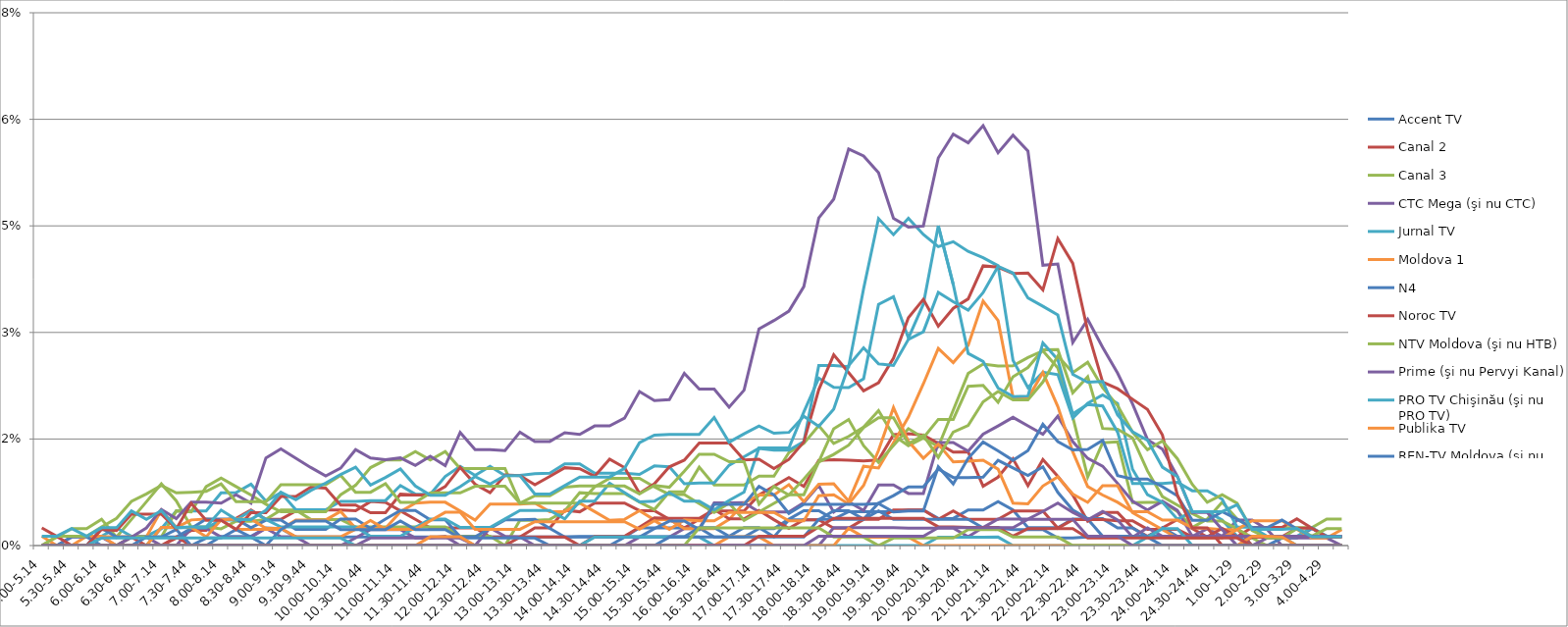
| Category | Accent TV | Canal 2 | Canal 3 | CTC Mega (şi nu CTC) | Jurnal TV | Moldova 1 | N4 | Noroc TV | NTV Moldova (şi nu HTB) | Prime (şi nu Pervyi Kanal) | PRO TV Chişinău (şi nu PRO TV) | Publika TV  | REN-TV Moldova (şi nu REN TV)  | RTR Moldova( şi nu PTP)  | THT Exclusiv (şi nu THT) | TV8 | TVC 21 | TVR MOLDOVA (şi nu TVR) | Canal Regional | Familia Domashniy | ITV | Moldova 2 | Alt canal |
|---|---|---|---|---|---|---|---|---|---|---|---|---|---|---|---|---|---|---|---|---|---|---|---|
| 5.00-5.14 | 0 | 0 | 0 | 0 | 0 | 0 | 0 | 0 | 0 | 0 | 0 | 0.001 | 0 | 0.002 | 0 | 0 | 0 | 0 | 0 | 0 | 0 | 0 | 0.001 |
| 5.15-5.29 | 0 | 0 | 0.001 | 0 | 0 | 0 | 0 | 0 | 0 | 0 | 0 | 0 | 0 | 0.001 | 0.001 | 0 | 0 | 0 | 0 | 0 | 0 | 0 | 0.001 |
| 5.30-5.44 | 0 | 0 | 0.002 | 0 | 0 | 0 | 0 | 0 | 0 | 0.001 | 0 | 0 | 0.001 | 0 | 0.001 | 0 | 0 | 0 | 0 | 0 | 0 | 0 | 0.002 |
| 5.45-5.59 | 0 | 0 | 0.002 | 0 | 0 | 0 | 0 | 0 | 0 | 0.001 | 0 | 0.001 | 0.001 | 0 | 0.001 | 0 | 0 | 0 | 0 | 0 | 0 | 0 | 0.001 |
| 6.00-6.14 | 0 | 0 | 0.004 | 0 | 0.001 | 0.001 | 0.002 | 0 | 0 | 0.001 | 0 | 0.001 | 0 | 0.002 | 0.003 | 0 | 0.001 | 0 | 0 | 0 | 0 | 0 | 0.003 |
| 6.15-6.29 | 0 | 0 | 0.001 | 0 | 0.003 | 0.001 | 0.001 | 0 | 0 | 0 | 0 | 0 | 0 | 0.002 | 0.004 | 0 | 0.001 | 0 | 0 | 0 | 0 | 0 | 0.003 |
| 6.30-6.44 | 0 | 0.001 | 0.004 | 0.001 | 0.001 | 0.001 | 0.001 | 0 | 0.001 | 0.001 | 0 | 0 | 0 | 0.004 | 0.006 | 0 | 0.001 | 0 | 0 | 0 | 0 | 0 | 0.005 |
| 6.45-6.59 | 0 | 0 | 0.006 | 0.001 | 0.001 | 0.001 | 0.001 | 0 | 0.001 | 0.002 | 0 | 0 | 0.001 | 0.004 | 0.007 | 0 | 0.001 | 0 | 0 | 0 | 0 | 0 | 0.004 |
| 7.00-7.14 | 0 | 0 | 0.009 | 0 | 0.002 | 0.005 | 0.001 | 0 | 0.001 | 0.005 | 0.003 | 0.003 | 0.001 | 0.004 | 0.008 | 0 | 0.001 | 0 | 0 | 0 | 0 | 0 | 0.005 |
| 7.15-7.29 | 0 | 0.001 | 0.006 | 0 | 0.005 | 0.003 | 0.001 | 0.001 | 0.005 | 0.004 | 0.003 | 0.003 | 0.002 | 0.002 | 0.007 | 0 | 0.001 | 0 | 0 | 0 | 0 | 0 | 0.003 |
| 7.30-7.44 | 0 | 0.002 | 0.003 | 0.002 | 0.005 | 0.004 | 0.002 | 0 | 0.005 | 0.006 | 0.003 | 0.003 | 0 | 0.006 | 0.008 | 0 | 0.001 | 0 | 0 | 0 | 0 | 0 | 0.003 |
| 7.45-7.59 | 0 | 0.002 | 0.003 | 0.002 | 0.005 | 0.004 | 0.004 | 0 | 0.008 | 0.006 | 0.003 | 0.001 | 0.001 | 0.004 | 0.008 | 0 | 0.001 | 0 | 0 | 0 | 0 | 0 | 0.003 |
| 8.00-8.14 | 0.001 | 0.004 | 0.002 | 0.001 | 0.007 | 0.004 | 0.004 | 0 | 0.009 | 0.006 | 0.004 | 0.004 | 0.001 | 0.004 | 0.009 | 0 | 0.001 | 0 | 0 | 0 | 0 | 0 | 0.005 |
| 8.15-8.29 | 0.001 | 0.004 | 0.003 | 0.001 | 0.007 | 0.002 | 0.004 | 0 | 0.008 | 0.007 | 0.004 | 0.004 | 0.002 | 0.002 | 0.006 | 0 | 0.001 | 0 | 0 | 0 | 0 | 0 | 0.004 |
| 8.30-8.44 | 0.001 | 0.005 | 0.003 | 0.001 | 0.009 | 0.002 | 0.003 | 0 | 0.007 | 0.006 | 0.005 | 0.004 | 0.001 | 0.005 | 0.006 | 0 | 0.001 | 0 | 0 | 0 | 0 | 0 | 0.004 |
| 8.45-8.59 | 0.002 | 0.004 | 0.004 | 0.002 | 0.006 | 0.002 | 0.004 | 0 | 0.006 | 0.012 | 0.004 | 0.002 | 0 | 0.005 | 0.006 | 0 | 0.001 | 0 | 0 | 0 | 0 | 0 | 0.005 |
| 9.00-9.14 | 0.002 | 0.004 | 0.005 | 0.001 | 0.007 | 0.002 | 0.004 | 0 | 0.005 | 0.014 | 0.003 | 0.002 | 0.002 | 0.007 | 0.009 | 0 | 0.001 | 0 | 0 | 0 | 0 | 0 | 0.008 |
| 9.15-9.29 | 0.001 | 0.005 | 0.005 | 0.001 | 0.005 | 0.004 | 0.002 | 0 | 0.005 | 0.012 | 0.003 | 0.001 | 0.003 | 0.007 | 0.009 | 0 | 0.001 | 0 | 0 | 0 | 0 | 0 | 0.006 |
| 9.30-9.44 | 0.001 | 0.005 | 0.004 | 0 | 0.005 | 0.004 | 0.002 | 0 | 0.005 | 0.011 | 0.003 | 0.001 | 0.003 | 0.008 | 0.009 | 0 | 0.001 | 0 | 0 | 0 | 0 | 0 | 0.008 |
| 9.45-9.59 | 0.001 | 0.005 | 0.004 | 0 | 0.005 | 0.004 | 0.002 | 0 | 0.005 | 0.01 | 0.003 | 0.001 | 0.003 | 0.008 | 0.009 | 0 | 0.001 | 0 | 0 | 0 | 0 | 0 | 0.009 |
| 10.00-10.14 | 0.001 | 0.005 | 0.004 | 0 | 0.006 | 0.005 | 0.004 | 0 | 0.007 | 0.011 | 0.003 | 0.001 | 0.002 | 0.006 | 0.01 | 0 | 0.001 | 0 | 0 | 0 | 0 | 0 | 0.01 |
| 10.15-10.29 | 0.001 | 0.005 | 0.003 | 0.001 | 0.006 | 0.002 | 0.004 | 0 | 0.008 | 0.014 | 0.003 | 0.002 | 0.002 | 0.006 | 0.008 | 0 | 0 | 0 | 0 | 0 | 0 | 0 | 0.011 |
| 10.30-10.44 | 0.001 | 0.006 | 0.003 | 0.002 | 0.006 | 0.002 | 0.002 | 0 | 0.011 | 0.012 | 0.001 | 0.004 | 0.002 | 0.005 | 0.008 | 0.001 | 0 | 0 | 0 | 0 | 0 | 0 | 0.009 |
| 10.45-10.59 | 0.001 | 0.006 | 0.003 | 0.002 | 0.006 | 0.002 | 0.004 | 0 | 0.012 | 0.012 | 0.001 | 0.002 | 0.002 | 0.005 | 0.009 | 0.001 | 0 | 0 | 0 | 0 | 0 | 0 | 0.01 |
| 11.00-11.14 | 0.001 | 0.005 | 0.003 | 0.002 | 0.008 | 0.005 | 0.005 | 0 | 0.012 | 0.012 | 0.001 | 0.002 | 0.003 | 0.007 | 0.006 | 0.001 | 0 | 0 | 0 | 0 | 0 | 0 | 0.011 |
| 11.15-11.29 | 0.001 | 0.004 | 0.003 | 0.001 | 0.007 | 0.006 | 0.005 | 0 | 0.013 | 0.011 | 0.003 | 0.002 | 0.002 | 0.007 | 0.006 | 0.001 | 0 | 0 | 0 | 0 | 0 | 0 | 0.008 |
| 11.30-11.44 | 0.001 | 0.002 | 0.003 | 0.001 | 0.007 | 0.006 | 0.004 | 0 | 0.012 | 0.013 | 0.004 | 0.003 | 0.002 | 0.007 | 0.007 | 0.001 | 0 | 0.001 | 0 | 0 | 0 | 0 | 0.007 |
| 11.45-11.59 | 0.001 | 0.002 | 0.003 | 0.001 | 0.01 | 0.006 | 0.004 | 0 | 0.013 | 0.011 | 0.004 | 0.005 | 0.002 | 0.008 | 0.007 | 0.001 | 0 | 0.001 | 0 | 0 | 0 | 0 | 0.007 |
| 12.00-12.14 | 0.001 | 0.002 | 0.001 | 0 | 0.011 | 0.005 | 0.001 | 0 | 0.011 | 0.016 | 0.003 | 0.005 | 0.001 | 0.011 | 0.007 | 0.001 | 0 | 0.001 | 0 | 0 | 0 | 0 | 0.008 |
| 12.15-12.29 | 0.001 | 0.002 | 0.001 | 0 | 0.01 | 0.004 | 0.001 | 0 | 0.011 | 0.014 | 0.003 | 0.002 | 0.001 | 0.009 | 0.008 | 0 | 0 | 0 | 0 | 0 | 0 | 0 | 0.01 |
| 12.30-12.44 | 0.001 | 0.001 | 0.001 | 0.002 | 0.011 | 0.006 | 0.002 | 0 | 0.011 | 0.014 | 0.003 | 0.002 | 0.001 | 0.007 | 0.008 | 0 | 0 | 0 | 0 | 0 | 0 | 0 | 0.009 |
| 12.45-12.59 | 0.001 | 0.001 | 0 | 0.001 | 0.01 | 0.006 | 0.004 | 0 | 0.011 | 0.013 | 0.004 | 0.002 | 0.001 | 0.01 | 0.008 | 0 | 0 | 0 | 0 | 0 | 0 | 0 | 0.01 |
| 13.00-13.14 | 0.001 | 0.001 | 0.004 | 0.001 | 0.01 | 0.006 | 0.004 | 0.001 | 0.006 | 0.016 | 0.005 | 0.002 | 0.001 | 0.01 | 0.006 | 0 | 0 | 0 | 0 | 0 | 0 | 0 | 0.01 |
| 13.15-13.29 | 0.001 | 0.002 | 0.004 | 0 | 0.01 | 0.006 | 0.004 | 0.001 | 0.006 | 0.015 | 0.005 | 0.003 | 0.001 | 0.009 | 0.007 | 0 | 0 | 0 | 0 | 0 | 0 | 0 | 0.007 |
| 13.30-13.44 | 0.001 | 0.002 | 0.004 | 0 | 0.01 | 0.005 | 0.002 | 0.001 | 0.006 | 0.015 | 0.005 | 0.003 | 0 | 0.01 | 0.007 | 0 | 0 | 0 | 0 | 0 | 0 | 0 | 0.007 |
| 13.45-13.59 | 0.001 | 0.005 | 0.005 | 0 | 0.011 | 0.005 | 0.001 | 0.001 | 0.006 | 0.016 | 0.004 | 0.003 | 0 | 0.011 | 0.008 | 0 | 0 | 0 | 0 | 0 | 0 | 0 | 0.008 |
| 14.00-14.14 | 0.001 | 0.005 | 0.007 | 0 | 0.011 | 0.006 | 0.001 | 0 | 0.006 | 0.016 | 0.006 | 0.003 | 0 | 0.011 | 0.008 | 0 | 0 | 0 | 0 | 0 | 0 | 0 | 0.01 |
| 14.15-14.29 | 0.001 | 0.006 | 0.007 | 0 | 0.01 | 0.005 | 0.001 | 0.001 | 0.008 | 0.017 | 0.006 | 0.003 | 0 | 0.01 | 0.008 | 0 | 0.001 | 0 | 0 | 0 | 0 | 0 | 0.01 |
| 14.30-14.44 | 0.001 | 0.006 | 0.007 | 0 | 0.01 | 0.004 | 0.001 | 0.001 | 0.009 | 0.017 | 0.009 | 0.003 | 0 | 0.012 | 0.008 | 0 | 0.001 | 0 | 0 | 0 | 0 | 0 | 0.01 |
| 14.45-14.59 | 0.001 | 0.006 | 0.007 | 0 | 0.01 | 0.004 | 0.001 | 0.001 | 0.009 | 0.018 | 0.007 | 0.003 | 0.001 | 0.011 | 0.008 | 0 | 0.001 | 0 | 0 | 0 | 0 | 0 | 0.011 |
| 15.00-15.14 | 0.002 | 0.005 | 0.006 | 0.001 | 0.01 | 0.005 | 0.001 | 0.003 | 0.009 | 0.022 | 0.006 | 0.002 | 0.001 | 0.007 | 0.007 | 0 | 0.001 | 0 | 0 | 0 | 0 | 0 | 0.014 |
| 15.15-15.29 | 0.002 | 0.005 | 0.005 | 0.001 | 0.011 | 0.004 | 0.001 | 0.004 | 0.008 | 0.02 | 0.006 | 0.003 | 0.002 | 0.009 | 0.008 | 0 | 0.001 | 0 | 0 | 0 | 0 | 0 | 0.016 |
| 15.30-15.44 | 0.002 | 0.004 | 0.008 | 0.001 | 0.011 | 0.004 | 0.001 | 0.004 | 0.007 | 0.021 | 0.007 | 0.002 | 0.003 | 0.011 | 0.008 | 0 | 0.001 | 0 | 0.001 | 0 | 0 | 0 | 0.016 |
| 15.45-15.59 | 0.002 | 0.002 | 0.008 | 0.002 | 0.009 | 0.002 | 0.001 | 0.004 | 0.007 | 0.024 | 0.006 | 0.004 | 0.003 | 0.012 | 0.01 | 0 | 0.001 | 0 | 0.001 | 0 | 0 | 0 | 0.016 |
| 16.00-16.14 | 0.002 | 0.004 | 0.011 | 0.002 | 0.009 | 0.002 | 0.003 | 0.004 | 0.006 | 0.022 | 0.006 | 0.003 | 0.002 | 0.014 | 0.013 | 0 | 0.001 | 0 | 0.001 | 0 | 0.002 | 0 | 0.016 |
| 16.15-16.29 | 0.001 | 0.005 | 0.009 | 0.006 | 0.009 | 0.002 | 0.003 | 0.005 | 0.005 | 0.022 | 0.005 | 0.003 | 0.006 | 0.014 | 0.013 | 0 | 0 | 0 | 0.001 | 0 | 0.002 | 0 | 0.018 |
| 16.30-16.44 | 0.001 | 0.005 | 0.009 | 0.006 | 0.011 | 0.004 | 0.001 | 0.004 | 0.006 | 0.019 | 0.006 | 0.005 | 0.006 | 0.014 | 0.012 | 0 | 0 | 0.001 | 0.001 | 0 | 0.002 | 0 | 0.015 |
| 16.45-16.59 | 0.001 | 0.005 | 0.009 | 0.006 | 0.013 | 0.006 | 0.003 | 0.004 | 0.004 | 0.022 | 0.008 | 0.005 | 0.006 | 0.012 | 0.012 | 0 | 0 | 0.001 | 0.001 | 0 | 0.002 | 0 | 0.016 |
| 17.00-17.14 | 0.002 | 0.007 | 0.01 | 0.005 | 0.014 | 0.007 | 0.003 | 0.005 | 0.005 | 0.03 | 0.014 | 0.005 | 0.008 | 0.012 | 0.006 | 0 | 0 | 0.001 | 0.001 | 0.001 | 0.002 | 0 | 0.017 |
| 17.15-17.29 | 0.002 | 0.008 | 0.01 | 0.005 | 0.013 | 0.007 | 0.001 | 0.004 | 0.006 | 0.032 | 0.014 | 0.005 | 0.007 | 0.011 | 0.008 | 0 | 0 | 0 | 0.001 | 0.001 | 0.002 | 0 | 0.016 |
| 17.30-17.44 | 0.004 | 0.01 | 0.013 | 0.005 | 0.013 | 0.009 | 0.004 | 0.002 | 0.007 | 0.033 | 0.014 | 0.003 | 0.005 | 0.012 | 0.007 | 0 | 0 | 0 | 0.001 | 0.001 | 0.002 | 0 | 0.016 |
| 17.45-17.59 | 0.005 | 0.008 | 0.014 | 0.006 | 0.015 | 0.006 | 0.004 | 0.004 | 0.007 | 0.036 | 0.019 | 0.003 | 0.006 | 0.015 | 0.009 | 0 | 0 | 0 | 0.001 | 0.001 | 0.002 | 0 | 0.018 |
| 18.00-18.14 | 0.005 | 0.012 | 0.017 | 0.008 | 0.025 | 0.009 | 0.004 | 0.004 | 0.012 | 0.046 | 0.024 | 0.007 | 0.006 | 0.022 | 0.012 | 0 | 0 | 0 | 0.004 | 0.003 | 0.002 | 0.001 | 0.017 |
| 18.15-18.29 | 0.004 | 0.012 | 0.014 | 0.005 | 0.025 | 0.009 | 0.005 | 0.002 | 0.016 | 0.049 | 0.022 | 0.007 | 0.006 | 0.027 | 0.013 | 0.003 | 0 | 0 | 0.004 | 0.004 | 0.001 | 0.001 | 0.019 |
| 18.30-18.44 | 0.005 | 0.012 | 0.015 | 0.006 | 0.025 | 0.006 | 0.005 | 0.002 | 0.018 | 0.056 | 0.022 | 0.006 | 0.006 | 0.024 | 0.014 | 0.003 | 0 | 0.002 | 0.004 | 0.004 | 0.001 | 0.001 | 0.025 |
| 18.45-18.59 | 0.005 | 0.012 | 0.017 | 0.005 | 0.036 | 0.011 | 0.004 | 0.004 | 0.014 | 0.055 | 0.023 | 0.008 | 0.006 | 0.022 | 0.017 | 0.003 | 0 | 0.001 | 0.004 | 0.004 | 0.001 | 0.001 | 0.028 |
| 19.00-19.14 | 0.005 | 0.012 | 0.019 | 0.009 | 0.046 | 0.011 | 0.006 | 0.004 | 0.012 | 0.052 | 0.034 | 0.013 | 0.006 | 0.023 | 0.018 | 0.003 | 0 | 0.001 | 0.005 | 0.004 | 0 | 0.001 | 0.026 |
| 19.15-19.29 | 0.005 | 0.016 | 0.016 | 0.009 | 0.044 | 0.014 | 0.007 | 0.005 | 0.014 | 0.046 | 0.035 | 0.019 | 0.005 | 0.026 | 0.018 | 0.003 | 0 | 0.001 | 0.004 | 0.004 | 0.001 | 0.001 | 0.025 |
| 19.30-19.44 | 0.005 | 0.016 | 0.014 | 0.007 | 0.046 | 0.018 | 0.008 | 0.005 | 0.016 | 0.045 | 0.029 | 0.015 | 0.005 | 0.032 | 0.014 | 0.002 | 0 | 0.001 | 0.004 | 0.004 | 0.001 | 0.001 | 0.029 |
| 19.45-19.59 | 0.005 | 0.016 | 0.015 | 0.007 | 0.044 | 0.023 | 0.008 | 0.005 | 0.015 | 0.045 | 0.034 | 0.012 | 0.005 | 0.035 | 0.016 | 0.002 | 0 | 0 | 0.004 | 0.004 | 0.001 | 0.001 | 0.03 |
| 20.00-20.14 | 0.004 | 0.014 | 0.014 | 0.015 | 0.042 | 0.028 | 0.011 | 0.004 | 0.018 | 0.055 | 0.045 | 0.014 | 0.011 | 0.031 | 0.012 | 0.002 | 0.001 | 0 | 0.004 | 0.003 | 0.001 | 0.003 | 0.036 |
| 20.15-20.29 | 0.004 | 0.013 | 0.019 | 0.015 | 0.043 | 0.026 | 0.01 | 0.005 | 0.018 | 0.058 | 0.037 | 0.012 | 0.009 | 0.033 | 0.016 | 0.002 | 0.001 | 0 | 0.004 | 0.003 | 0.001 | 0.003 | 0.034 |
| 20.30-20.44 | 0.005 | 0.013 | 0.024 | 0.013 | 0.041 | 0.028 | 0.01 | 0.004 | 0.022 | 0.057 | 0.027 | 0.012 | 0.012 | 0.035 | 0.017 | 0.001 | 0.001 | 0 | 0.004 | 0.003 | 0.002 | 0.003 | 0.033 |
| 20.45-20.59 | 0.005 | 0.008 | 0.026 | 0.016 | 0.041 | 0.034 | 0.01 | 0.004 | 0.023 | 0.059 | 0.026 | 0.012 | 0.015 | 0.039 | 0.02 | 0.003 | 0.001 | 0 | 0.002 | 0.003 | 0.002 | 0.003 | 0.036 |
| 21.00-21.14 | 0.006 | 0.01 | 0.025 | 0.017 | 0.039 | 0.032 | 0.012 | 0.004 | 0.02 | 0.055 | 0.022 | 0.011 | 0.013 | 0.039 | 0.022 | 0.004 | 0.001 | 0 | 0.002 | 0.003 | 0.002 | 0.003 | 0.039 |
| 21.15-21.29 | 0.005 | 0.012 | 0.025 | 0.018 | 0.026 | 0.021 | 0.011 | 0.005 | 0.024 | 0.058 | 0.021 | 0.006 | 0.012 | 0.038 | 0.02 | 0.004 | 0 | 0 | 0.002 | 0.001 | 0.001 | 0.003 | 0.038 |
| 21.30-21.44 | 0.003 | 0.008 | 0.026 | 0.017 | 0.022 | 0.021 | 0.01 | 0.005 | 0.025 | 0.056 | 0.021 | 0.006 | 0.013 | 0.038 | 0.021 | 0.004 | 0 | 0 | 0.002 | 0.002 | 0.001 | 0.004 | 0.035 |
| 21.45-21.59 | 0.003 | 0.012 | 0.027 | 0.016 | 0.024 | 0.024 | 0.011 | 0.005 | 0.028 | 0.039 | 0.029 | 0.008 | 0.017 | 0.036 | 0.023 | 0.005 | 0 | 0 | 0.002 | 0.002 | 0.001 | 0.004 | 0.034 |
| 22.00-22.14 | 0.003 | 0.01 | 0.025 | 0.018 | 0.024 | 0.02 | 0.007 | 0.002 | 0.028 | 0.04 | 0.026 | 0.01 | 0.015 | 0.043 | 0.027 | 0.006 | 0 | 0 | 0.001 | 0.002 | 0.001 | 0.004 | 0.032 |
| 22.15-22.29 | 0.004 | 0.007 | 0.018 | 0.015 | 0.018 | 0.013 | 0.005 | 0.004 | 0.022 | 0.029 | 0.019 | 0.007 | 0.013 | 0.04 | 0.024 | 0.005 | 0 | 0 | 0.001 | 0.002 | 0 | 0.004 | 0.024 |
| 22.30-22.44 | 0.004 | 0.003 | 0.01 | 0.012 | 0.02 | 0.008 | 0.004 | 0.004 | 0.024 | 0.032 | 0.02 | 0.006 | 0.014 | 0.03 | 0.026 | 0.004 | 0 | 0 | 0.001 | 0.001 | 0 | 0.001 | 0.023 |
| 22.45-22.59 | 0.001 | 0.005 | 0.014 | 0.011 | 0.021 | 0.007 | 0.004 | 0.004 | 0.016 | 0.028 | 0.02 | 0.008 | 0.015 | 0.023 | 0.022 | 0.005 | 0 | 0 | 0.001 | 0.001 | 0 | 0.001 | 0.023 |
| 23.00-23.14 | 0.001 | 0.005 | 0.015 | 0.009 | 0.02 | 0.006 | 0.002 | 0.003 | 0.016 | 0.024 | 0.016 | 0.008 | 0.01 | 0.022 | 0.02 | 0.004 | 0 | 0 | 0.001 | 0.001 | 0 | 0.001 | 0.018 |
| 23.15-23.29 | 0.001 | 0.002 | 0.006 | 0.006 | 0.011 | 0.005 | 0.002 | 0.003 | 0.015 | 0.02 | 0.009 | 0.005 | 0.009 | 0.021 | 0.016 | 0.001 | 0 | 0 | 0.001 | 0.001 | 0 | 0 | 0.016 |
| 23.30-23.44 | 0.001 | 0.001 | 0.006 | 0.005 | 0.007 | 0.005 | 0.001 | 0.002 | 0.011 | 0.015 | 0.009 | 0.003 | 0.009 | 0.019 | 0.013 | 0.003 | 0.001 | 0 | 0.001 | 0.001 | 0 | 0 | 0.015 |
| 23.45-23.59 | 0.001 | 0.002 | 0.006 | 0.006 | 0.006 | 0.004 | 0.003 | 0.002 | 0.007 | 0.014 | 0.009 | 0.002 | 0.008 | 0.016 | 0.015 | 0.001 | 0.002 | 0 | 0 | 0.001 | 0 | 0 | 0.011 |
| 24.00-24.14 | 0.001 | 0.004 | 0.005 | 0.005 | 0.004 | 0.004 | 0.001 | 0.002 | 0.006 | 0.01 | 0.009 | 0.001 | 0.007 | 0.007 | 0.012 | 0.001 | 0.002 | 0 | 0 | 0.001 | 0 | 0 | 0.01 |
| 24.15-24.29 | 0.001 | 0.002 | 0.003 | 0.001 | 0.005 | 0.003 | 0.001 | 0.001 | 0.005 | 0.005 | 0.008 | 0.001 | 0.004 | 0.002 | 0.009 | 0.001 | 0 | 0 | 0 | 0.001 | 0 | 0 | 0.005 |
| 24.30-24.44 | 0.001 | 0.001 | 0.004 | 0.002 | 0.005 | 0.002 | 0.001 | 0.001 | 0.003 | 0.005 | 0.008 | 0.001 | 0.004 | 0.002 | 0.006 | 0.001 | 0 | 0 | 0 | 0.001 | 0 | 0 | 0.005 |
| 24.45-24.59 | 0.001 | 0.001 | 0.006 | 0.001 | 0.004 | 0.002 | 0.001 | 0.002 | 0.003 | 0.002 | 0.007 | 0.001 | 0.005 | 0 | 0.007 | 0.001 | 0 | 0 | 0 | 0.001 | 0 | 0 | 0.005 |
| 1.00-1.29 | 0.001 | 0.002 | 0.004 | 0.004 | 0.001 | 0.002 | 0.001 | 0.001 | 0.002 | 0 | 0.003 | 0.002 | 0.004 | 0 | 0.006 | 0.001 | 0 | 0 | 0 | 0.001 | 0 | 0 | 0.006 |
| 1.30-1. 59 | 0 | 0 | 0.003 | 0.004 | 0.001 | 0.001 | 0 | 0.003 | 0.001 | 0 | 0.003 | 0.003 | 0.003 | 0.001 | 0.002 | 0.001 | 0 | 0.001 | 0 | 0 | 0 | 0 | 0.002 |
| 2.00-2.29 | 0 | 0 | 0.003 | 0.002 | 0.001 | 0.001 | 0 | 0.003 | 0 | 0.001 | 0.001 | 0.003 | 0.003 | 0.001 | 0.001 | 0.001 | 0 | 0.001 | 0 | 0 | 0 | 0 | 0.002 |
| 2.30-2.59 | 0 | 0 | 0.003 | 0 | 0.001 | 0.001 | 0.001 | 0.003 | 0 | 0.001 | 0.001 | 0.003 | 0.004 | 0.001 | 0.001 | 0.001 | 0 | 0.001 | 0 | 0 | 0 | 0 | 0.002 |
| 3.00-3.29 | 0 | 0 | 0.003 | 0 | 0 | 0.001 | 0.001 | 0.004 | 0 | 0.001 | 0.001 | 0.002 | 0.002 | 0.002 | 0.002 | 0.001 | 0 | 0 | 0 | 0 | 0 | 0 | 0.002 |
| 3.30-3.59 | 0 | 0 | 0.003 | 0 | 0 | 0.001 | 0.002 | 0.002 | 0 | 0.001 | 0.003 | 0.001 | 0.001 | 0.002 | 0.001 | 0.001 | 0 | 0 | 0 | 0 | 0 | 0 | 0.001 |
| 4.00-4.29 | 0 | 0 | 0.004 | 0 | 0 | 0.001 | 0.001 | 0.001 | 0 | 0.001 | 0.001 | 0.001 | 0.001 | 0.001 | 0.002 | 0.001 | 0 | 0 | 0 | 0 | 0 | 0 | 0.001 |
| 4.30-4.59 | 0 | 0 | 0.004 | 0 | 0 | 0.001 | 0.001 | 0.001 | 0 | 0 | 0.001 | 0.002 | 0.001 | 0.001 | 0.002 | 0.001 | 0 | 0 | 0 | 0 | 0 | 0 | 0.001 |